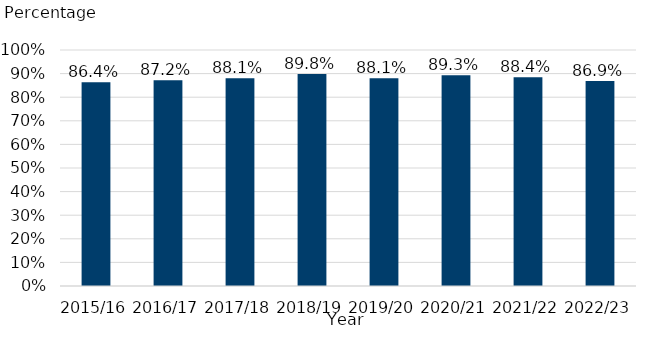
| Category | % transferring to Welsh-medium education |
|---|---|
| 2015/16 | 0.864 |
| 2016/17 | 0.872 |
| 2017/18 | 0.881 |
| 2018/19 | 0.898 |
| 2019/20 | 0.881 |
| 2020/21 | 0.893 |
| 2021/22 | 0.884 |
| 2022/23 | 0.869 |